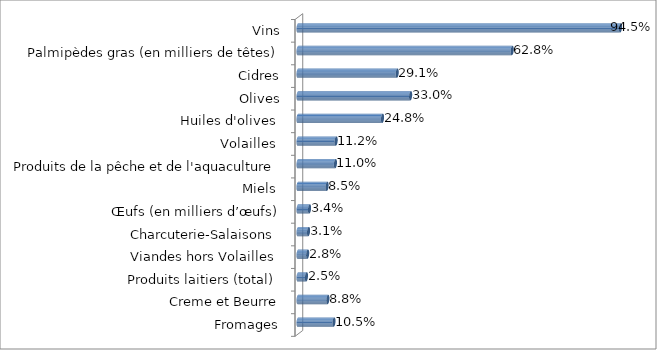
| Category | Series 0 |
|---|---|
| Fromages | 0.105 |
| Creme et Beurre | 0.088 |
| Produits laitiers (total)  | 0.025 |
| Viandes hors Volailles  | 0.028 |
| Charcuterie-Salaisons  | 0.031 |
| Œufs (en milliers d’œufs) | 0.034 |
| Miels  | 0.085 |
| Produits de la pêche et de l'aquaculture | 0.11 |
| Volailles  | 0.112 |
| Huiles d'olives  | 0.248 |
| Olives | 0.33 |
| Cidres | 0.291 |
| Palmipèdes gras (en milliers de têtes) | 0.628 |
| Vins | 0.945 |